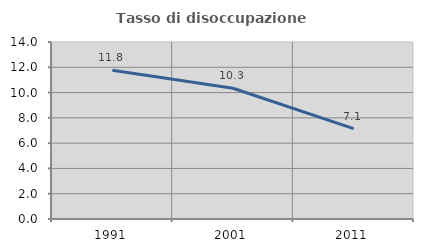
| Category | Tasso di disoccupazione giovanile  |
|---|---|
| 1991.0 | 11.765 |
| 2001.0 | 10.345 |
| 2011.0 | 7.143 |